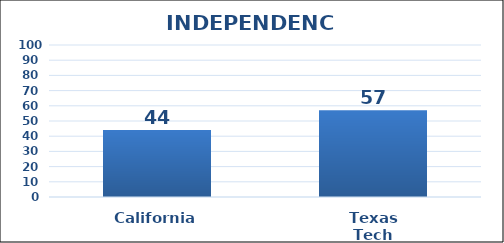
| Category | Series 0 |
|---|---|
| California | 44 |
| Texas Tech | 57 |